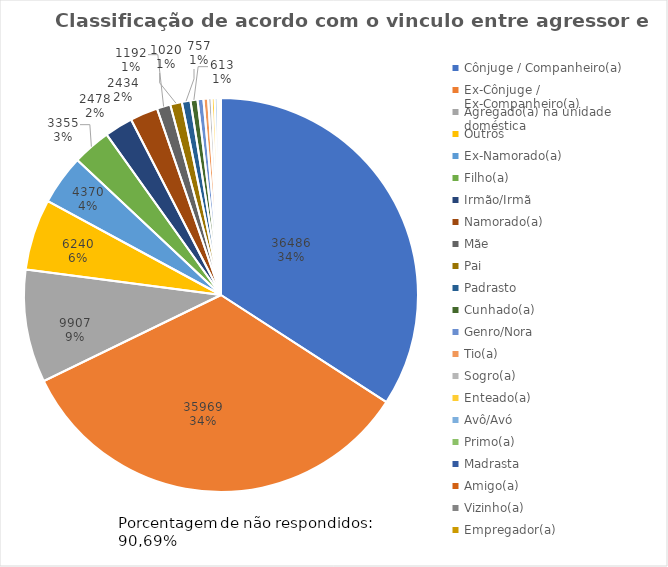
| Category | Series 0 |
|---|---|
| Cônjuge / Companheiro(a) | 36486 |
| Ex-Cônjuge / Ex-Companheiro(a)  | 35969 |
| Agregado(a) na unidade doméstica | 9907 |
| Outros | 6240 |
| Ex-Namorado(a) | 4370 |
| Filho(a) | 3355 |
| Irmão/Irmã | 2478 |
| Namorado(a) | 2434 |
| Mãe | 1192 |
| Pai | 1020 |
| Padrasto | 757 |
| Cunhado(a) | 613 |
| Genro/Nora | 516 |
| Tio(a) | 409 |
| Sogro(a) | 300 |
| Enteado(a) | 268 |
| Avô/Avó | 244 |
| Primo(a) | 135 |
| Madrasta | 62 |
| Amigo(a) | 51 |
| Vizinho(a) | 39 |
| Empregador(a) | 17 |